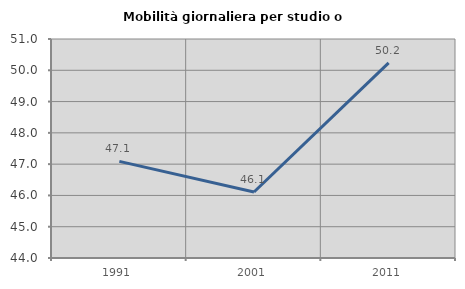
| Category | Mobilità giornaliera per studio o lavoro |
|---|---|
| 1991.0 | 47.088 |
| 2001.0 | 46.109 |
| 2011.0 | 50.235 |